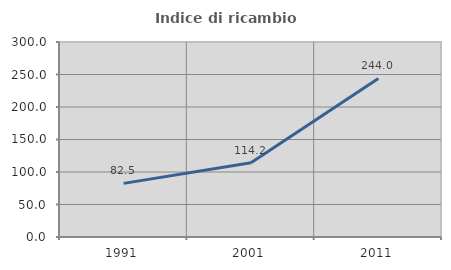
| Category | Indice di ricambio occupazionale  |
|---|---|
| 1991.0 | 82.511 |
| 2001.0 | 114.208 |
| 2011.0 | 243.966 |